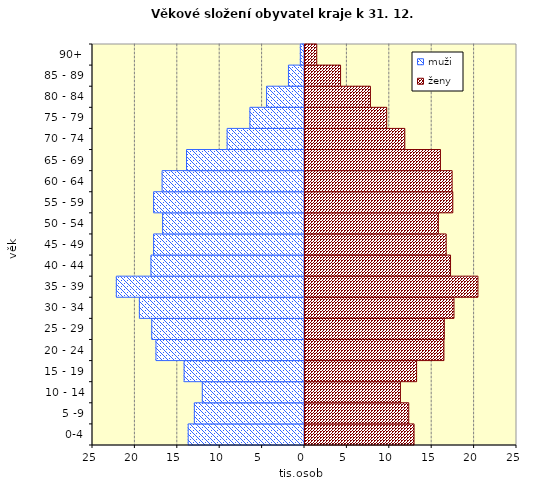
| Category | muži | ženy |
|---|---|---|
| 0-4 | -13713 | 12980 |
|  5 -9 | -12988 | 12351 |
|  10 - 14 | -12051 | 11371 |
| 15 - 19 | -14198 | 13278 |
| 20 - 24 | -17516 | 16502 |
| 25 - 29 | -18013 | 16548 |
| 30 - 34 | -19471 | 17688 |
| 35 - 39 | -22188 | 20512 |
| 40 - 44 | -18108 | 17281 |
| 45 - 49 | -17797 | 16766 |
| 50 - 54 | -16734 | 15843 |
| 55 - 59 | -17796 | 17547 |
| 60 - 64 | -16790 | 17466 |
| 65 - 69 | -13915 | 16090 |
| 70 - 74 | -9121 | 11888 |
| 75 - 79 | -6440 | 9752 |
| 80 - 84 | -4471 | 7834 |
| 85 - 89 | -1891 | 4313 |
| 90+ | -493 | 1503 |